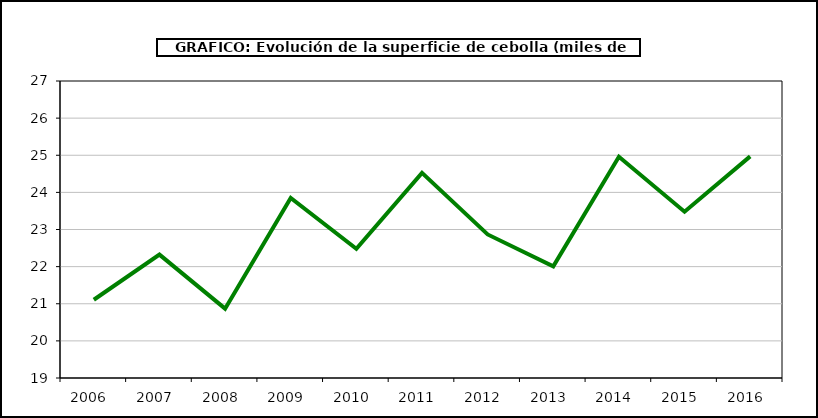
| Category | superficie |
|---|---|
| 2006.0 | 21.108 |
| 2007.0 | 22.324 |
| 2008.0 | 20.868 |
| 2009.0 | 23.851 |
| 2010.0 | 22.478 |
| 2011.0 | 24.526 |
| 2012.0 | 22.867 |
| 2013.0 | 22.008 |
| 2014.0 | 24.961 |
| 2015.0 | 23.48 |
| 2016.0 | 24.969 |